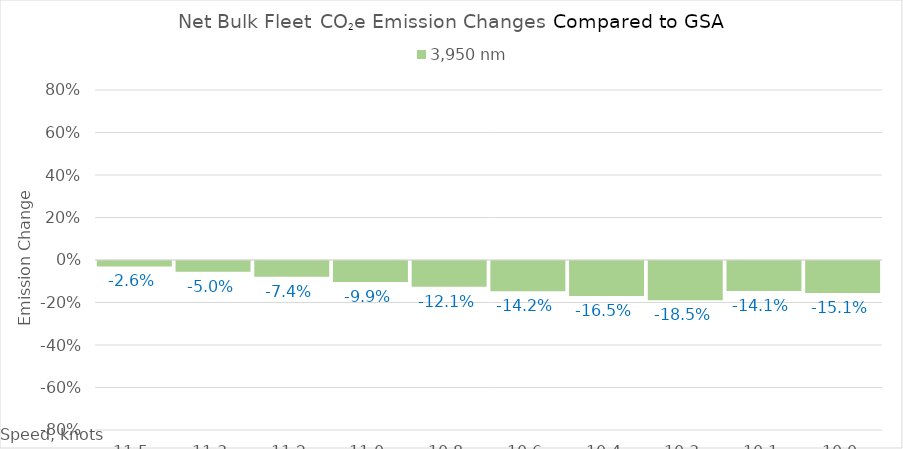
| Category | 3,950 |
|---|---|
| 11.52 | -0.026 |
| 11.34 | -0.05 |
| 11.16 | -0.074 |
| 10.98 | -0.099 |
| 10.8 | -0.121 |
| 10.620000000000001 | -0.142 |
| 10.440000000000001 | -0.165 |
| 10.260000000000002 | -0.185 |
| 10.080000000000002 | -0.141 |
| 10.0 | -0.151 |